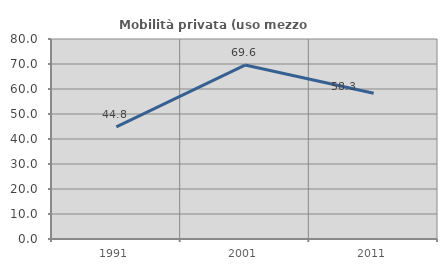
| Category | Mobilità privata (uso mezzo privato) |
|---|---|
| 1991.0 | 44.828 |
| 2001.0 | 69.565 |
| 2011.0 | 58.333 |